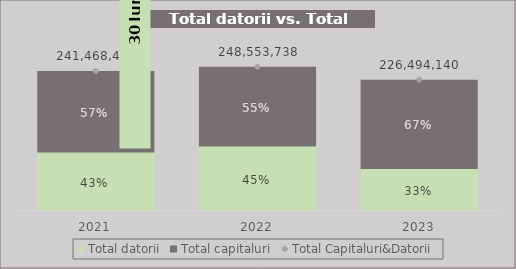
| Category | Total datorii | Total capitaluri |
|---|---|---|
| 2021.0 | 102626108 | 138842299 |
| 2022.0 | 112991403 | 135562335 |
| 2023.0 | 74256382 | 152237758 |